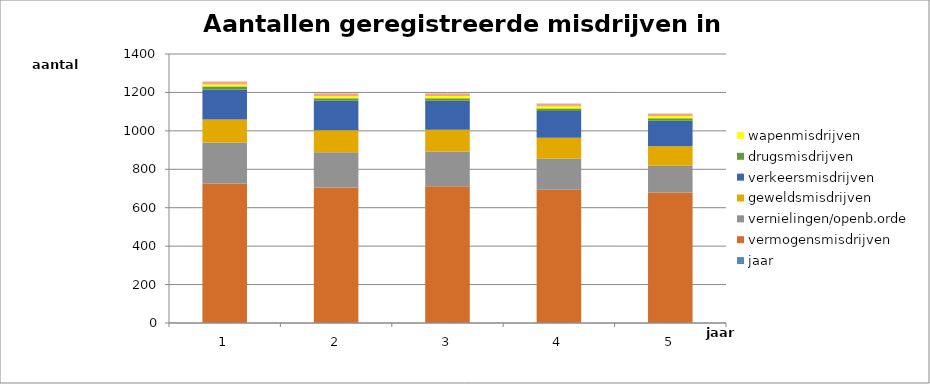
| Category | jaar | vermogensmisdrijven | vernielingen/openb.orde | geweldsmisdrijven | verkeersmisdrijven | drugsmisdrijven | wapenmisdrijven | overige misdrijven |
|---|---|---|---|---|---|---|---|---|
| 0 | 2009 | 724065 | 213055 | 120335 | 156175 | 18580 | 6630 | 15635 |
| 1 | 2010 | 703590 | 183690 | 113425 | 154105 | 17355 | 6475 | 15630 |
| 2 | 2011 | 710280 | 180900 | 111995 | 152015 | 16705 | 7340 | 15120 |
| 3 | 2012 | 691730 | 161395 | 108660 | 139185 | 17670 | 7030 | 14760 |
| 4 | 2013 | 676945 | 139900 | 101155 | 132560 | 17570 | 6545 | 13595 |